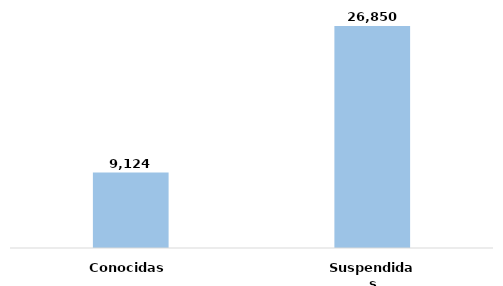
| Category | Series 0 |
|---|---|
| Conocidas | 0.254 |
| Suspendidas | 0.746 |